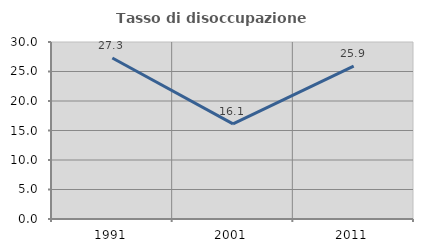
| Category | Tasso di disoccupazione giovanile  |
|---|---|
| 1991.0 | 27.284 |
| 2001.0 | 16.122 |
| 2011.0 | 25.904 |